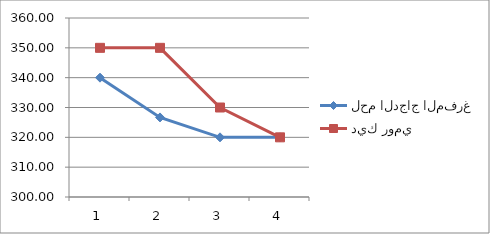
| Category | لحم الدجاج المفرغ | ديك رومي |
|---|---|---|
| 0 | 340 | 350 |
| 1 | 326.67 | 350 |
| 2 | 320 | 330 |
| 3 | 320 | 320 |